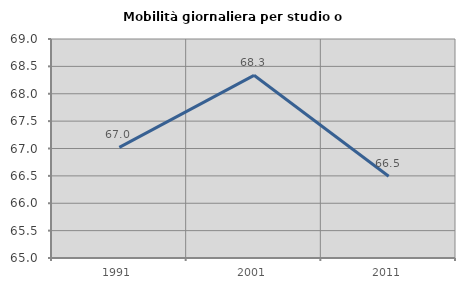
| Category | Mobilità giornaliera per studio o lavoro |
|---|---|
| 1991.0 | 67.02 |
| 2001.0 | 68.337 |
| 2011.0 | 66.493 |